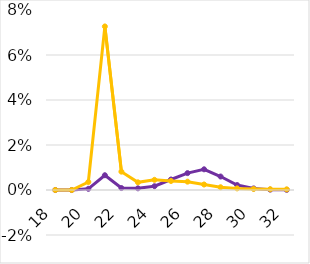
| Category | TECount | VirusCount |
|---|---|---|
| 18.0 | 0 | 0 |
| 19.0 | 0 | 0 |
| 20.0 | 0.001 | 0.004 |
| 21.0 | 0.007 | 0.073 |
| 22.0 | 0.001 | 0.008 |
| 23.0 | 0.001 | 0.003 |
| 24.0 | 0.002 | 0.005 |
| 25.0 | 0.005 | 0.004 |
| 26.0 | 0.008 | 0.004 |
| 27.0 | 0.009 | 0.002 |
| 28.0 | 0.006 | 0.001 |
| 29.0 | 0.002 | 0.001 |
| 30.0 | 0.001 | 0 |
| 31.0 | 0 | 0 |
| 32.0 | 0 | 0 |